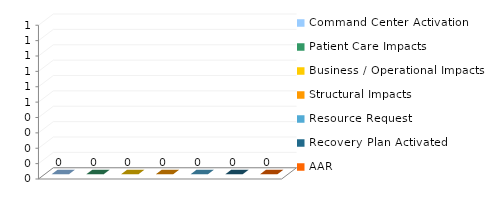
| Category | ALERT TYPE |
|---|---|
| Command Center Activation | 0 |
| Patient Care Impacts | 0 |
| Business / Operational Impacts | 0 |
| Structural Impacts | 0 |
| Resource Request | 0 |
| Recovery Plan Activated | 0 |
| AAR | 0 |